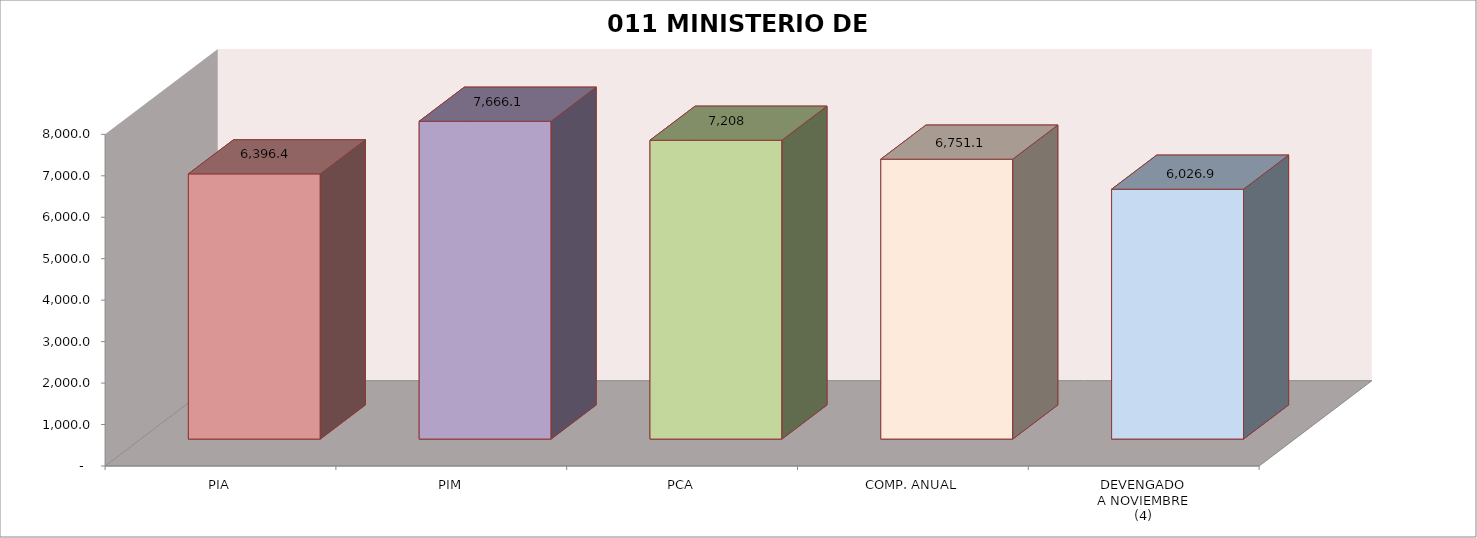
| Category | 011 MINISTERIO DE SALUD |
|---|---|
| PIA | 6396.414 |
| PIM | 7666.086 |
| PCA | 7207.828 |
| COMP. ANUAL | 6751.054 |
| DEVENGADO
A NOVIEMBRE
(4) | 6026.94 |